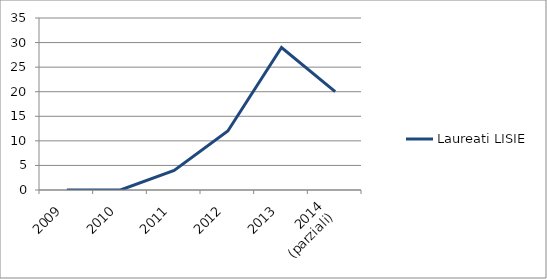
| Category | Laureati LISIE |
|---|---|
| 2009 | 0 |
| 2010 | 0 |
| 2011 | 4 |
| 2012 | 12 |
| 2013 | 29 |
| 2014
(parziali) | 20 |